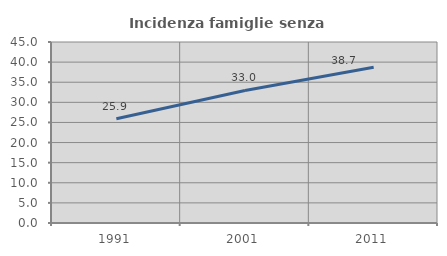
| Category | Incidenza famiglie senza nuclei |
|---|---|
| 1991.0 | 25.926 |
| 2001.0 | 32.95 |
| 2011.0 | 38.722 |